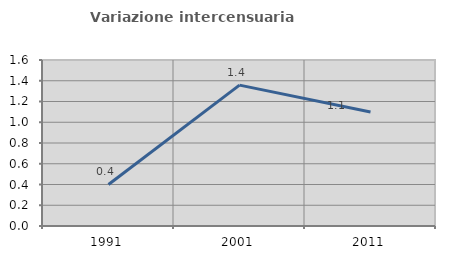
| Category | Variazione intercensuaria annua |
|---|---|
| 1991.0 | 0.4 |
| 2001.0 | 1.358 |
| 2011.0 | 1.099 |